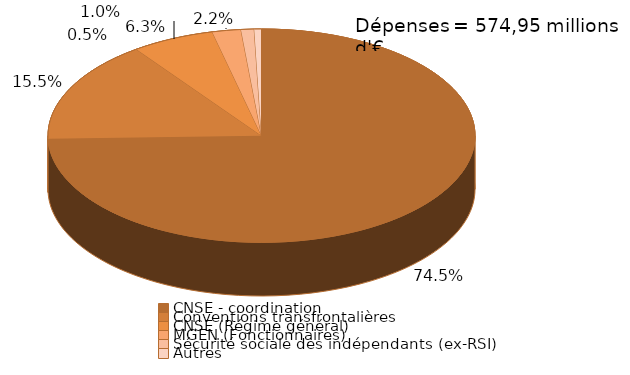
| Category | Series 0 |
|---|---|
| CNSE - coordination | 428617278.82 |
| Conventions transfrontalières | 88981870.84 |
| CNSE (Régime général) | 36038814.56 |
| MGEN (Fonctionnaires) | 12464211.06 |
| Sécurité sociale des indépendants (ex-RSI) | 5703605 |
| Autres | 3139728.71 |